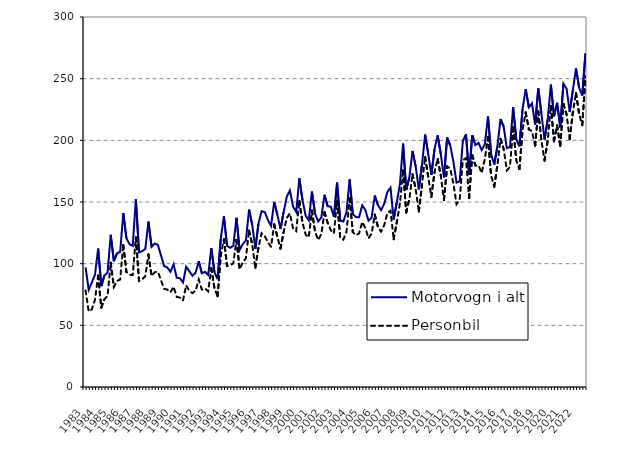
| Category | Motorvogn i alt | Personbil |
|---|---|---|
| 1983.0 | 97 | 78.3 |
| nan | 78.8 | 61.3 |
| nan | 84.8 | 63 |
| nan | 91.2 | 70.8 |
| 1984.0 | 112.2 | 90.4 |
| nan | 81.8 | 64.4 |
| nan | 90.4 | 71.1 |
| nan | 92.9 | 73.9 |
| 1985.0 | 123.4 | 100.8 |
| nan | 102 | 81.1 |
| nan | 108.4 | 86 |
| nan | 109.6 | 87.1 |
| 1986.0 | 141 | 115.2 |
| nan | 120.5 | 93.2 |
| nan | 115.7 | 91.1 |
| nan | 114.4 | 90.8 |
| 1987.0 | 152.2 | 121.3 |
| nan | 109.2 | 86.1 |
| nan | 110.1 | 87.3 |
| nan | 112 | 89.8 |
| 1988.0 | 134.1 | 107.5 |
| nan | 113.7 | 90 |
| nan | 116.3 | 93.1 |
| nan | 115.2 | 93.4 |
| 1989.0 | 106.6 | 86.4 |
| nan | 98 | 79.6 |
| nan | 96.9 | 79 |
| nan | 93.4 | 76.8 |
| 1990.0 | 99.4 | 81.3 |
| nan | 88.6 | 73.1 |
| nan | 88.2 | 72.5 |
| nan | 84.8 | 70.2 |
| 1991.0 | 97.5 | 82.4 |
| nan | 93.9 | 78 |
| nan | 90.2 | 76.1 |
| nan | 92.6 | 78.1 |
| 1992.0 | 102 | 87.1 |
| nan | 92.2 | 78.9 |
| nan | 93.3 | 79.9 |
| nan | 90.8 | 77.6 |
| 1993.0 | 112.6 | 96.5 |
| nan | 93 | 80.1 |
| nan | 87.5 | 73.6 |
| nan | 120.1 | 106.6 |
| 1994.0 | 138.4 | 120 |
| nan | 114.5 | 98.1 |
| nan | 112.8 | 98.8 |
| nan | 114.5 | 100.2 |
| 1995.0 | 137.2 | 119.3 |
| nan | 111 | 95.4 |
| nan | 115.9 | 101 |
| nan | 118.8 | 104.4 |
| 1996.0 | 143.9 | 126.9 |
| nan | 131.6 | 115.7 |
| nan | 112 | 96.7 |
| nan | 132.5 | 113.1 |
| 1997.0 | 142.6 | 124.8 |
| nan | 141.8 | 122.5 |
| nan | 135.4 | 117.3 |
| nan | 130.6 | 113.7 |
| 1998.0 | 150 | 131.9 |
| nan | 139.8 | 122 |
| nan | 128.1 | 112.1 |
| nan | 141.8 | 125.6 |
| 1999.0 | 154.2 | 137.1 |
| nan | 159.3 | 140.7 |
| nan | 146.3 | 128.7 |
| nan | 141.9 | 126.4 |
| 2000.0 | 169.1 | 150.9 |
| nan | 151.5 | 133.4 |
| nan | 139 | 123.5 |
| nan | 135.1 | 121.4 |
| 2001.0 | 158.5 | 143.1 |
| nan | 140.46 | 125.7 |
| nan | 134.24 | 119.2 |
| nan | 137.495 | 124.072 |
| 2002.0 | 155.814 | 141.724 |
| nan | 146.543 | 133.19 |
| nan | 146.231 | 127.141 |
| nan | 137.967 | 124.641 |
| 2003.0 | 165.679 | 150.811 |
| nan | 135.021 | 121.101 |
| nan | 134.111 | 119.491 |
| nan | 142.013 | 125.959 |
| 2004.0 | 168.309 | 153.043 |
| nan | 140.267 | 125.568 |
| nan | 137.77 | 123.121 |
| nan | 137.685 | 124.506 |
| 2005.0 | 147.311 | 133.756 |
| nan | 143.517 | 128.79 |
| nan | 134.783 | 120.571 |
| nan | 137.37 | 124.382 |
| 2006.0 | 155.213 | 139.728 |
| nan | 147.444 | 129.572 |
| nan | 143.451 | 126.006 |
| nan | 148.561 | 131.195 |
| 2007.0 | 158.1 | 141.084 |
| nan | 161.613 | 142.897 |
| nan | 135.821 | 119.753 |
| nan | 149.791 | 133.498 |
| 2008.0 | 164.642 | 148.614 |
| nan | 197.287 | 175.714 |
| nan | 159.718 | 141.407 |
| nan | 170.057 | 152.54 |
| 2009.0 | 191.38 | 172.559 |
| nan | 178.906 | 160.765 |
| nan | 160.234 | 142.312 |
| nan | 179.857 | 163.532 |
| 2010.0 | 204.636 | 186.507 |
| nan | 188.957 | 170.463 |
| nan | 172.077 | 154.156 |
| nan | 192.961 | 174.399 |
| 2011.0 | 204.005 | 184.86 |
| nan | 188.741 | 171.333 |
| nan | 169.934 | 151.694 |
| nan | 202.176 | 178.919 |
| 2012.0 | 195.829 | 177.072 |
| nan | 182.751 | 165.128 |
| nan | 165.73 | 148.242 |
| nan | 166.805 | 151.728 |
| 2013.0 | 199.181 | 183.653 |
| nan | 205.015 | 185.634 |
| nan | 172.044 | 153.21 |
| nan | 204.1 | 188.079 |
| 2014.0 | 196.177 | 179.552 |
| nan | 197.965 | 179.767 |
| nan | 192.105 | 173.474 |
| nan | 196.809 | 184.739 |
| 2015.0 | 219.419 | 202.592 |
| nan | 188.696 | 171.451 |
| nan | 180.388 | 162.297 |
| nan | 195.23 | 179.891 |
| 2016.0 | 217.298 | 201.197 |
| nan | 210.949 | 192.893 |
| nan | 193.648 | 175.642 |
| nan | 194.663 | 178.455 |
| 2017.0 | 227.029 | 210.738 |
| nan | 200.767 | 183.708 |
| nan | 195.059 | 176.766 |
| nan | 225.423 | 208.218 |
| 2018.0 | 241.528 | 222.678 |
| nan | 226.771 | 208.839 |
| nan | 230.044 | 207.395 |
| nan | 212.667 | 195.666 |
| 2019.0 | 242.056 | 223.584 |
| nan | 221.711 | 199.972 |
| nan | 200.668 | 183.518 |
| nan | 216.92 | 199.72 |
| 2020.0 | 245.163 | 227.947 |
| nan | 219.434 | 199.239 |
| nan | 230.409 | 212.039 |
| nan | 210.538 | 195.423 |
| 2021.0 | 246.037 | 229.482 |
| nan | 241.941 | 221.096 |
| nan | 223.162 | 200.95 |
| nan | 240.674 | 222.834 |
| 2022.0 | 258.319 | 238.379 |
| nan | 242.592 | 221.267 |
| nan | 236.373 | 212.275 |
| nan | 270.368 | 251.769 |